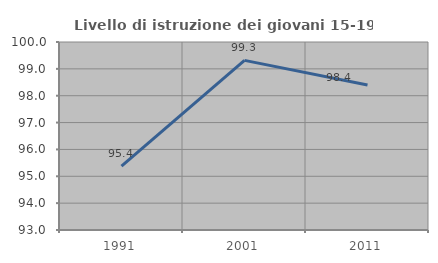
| Category | Livello di istruzione dei giovani 15-19 anni |
|---|---|
| 1991.0 | 95.376 |
| 2001.0 | 99.315 |
| 2011.0 | 98.4 |